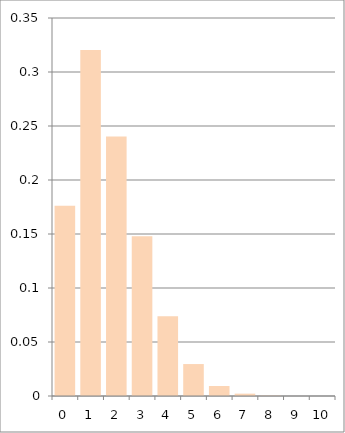
| Category | Series 0 |
|---|---|
| 0.0 | 0.176 |
| 1.0 | 0.32 |
| 2.0 | 0.24 |
| 3.0 | 0.148 |
| 4.0 | 0.074 |
| 5.0 | 0.03 |
| 6.0 | 0.009 |
| 7.0 | 0.002 |
| 8.0 | 0 |
| 9.0 | 0 |
| 10.0 | 0 |